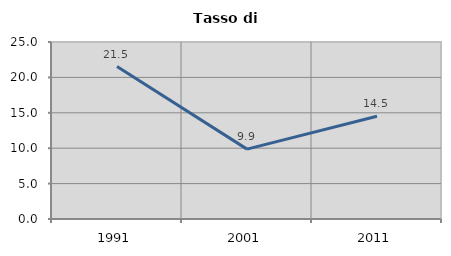
| Category | Tasso di disoccupazione   |
|---|---|
| 1991.0 | 21.53 |
| 2001.0 | 9.869 |
| 2011.0 | 14.52 |